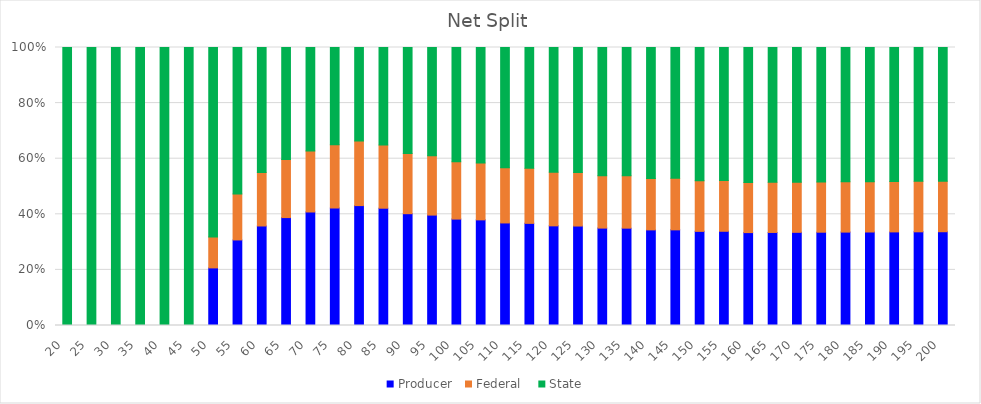
| Category | Producer  | Federal   | State   |
|---|---|---|---|
| 20.0 | 0 | 0 | 1 |
| 25.0 | 0 | 0 | 1 |
| 30.0 | 0 | 0 | 1 |
| 35.0 | 0 | 0 | 1 |
| 40.0 | 0 | 0 | 1 |
| 45.0 | 0 | 0 | 1 |
| 50.0 | 0.207 | 0.112 | 0.681 |
| 55.0 | 0.308 | 0.166 | 0.527 |
| 60.0 | 0.358 | 0.193 | 0.449 |
| 65.0 | 0.388 | 0.209 | 0.403 |
| 70.0 | 0.408 | 0.22 | 0.372 |
| 75.0 | 0.423 | 0.228 | 0.35 |
| 80.0 | 0.431 | 0.232 | 0.336 |
| 85.0 | 0.422 | 0.227 | 0.351 |
| 90.0 | 0.402 | 0.217 | 0.381 |
| 95.0 | 0.397 | 0.214 | 0.389 |
| 100.0 | 0.383 | 0.206 | 0.411 |
| 105.0 | 0.38 | 0.205 | 0.415 |
| 110.0 | 0.369 | 0.199 | 0.432 |
| 115.0 | 0.367 | 0.198 | 0.435 |
| 120.0 | 0.358 | 0.193 | 0.448 |
| 125.0 | 0.358 | 0.193 | 0.45 |
| 130.0 | 0.35 | 0.189 | 0.461 |
| 135.0 | 0.35 | 0.189 | 0.461 |
| 140.0 | 0.344 | 0.185 | 0.471 |
| 145.0 | 0.344 | 0.185 | 0.471 |
| 150.0 | 0.339 | 0.182 | 0.479 |
| 155.0 | 0.339 | 0.183 | 0.479 |
| 160.0 | 0.334 | 0.18 | 0.486 |
| 165.0 | 0.335 | 0.18 | 0.485 |
| 170.0 | 0.335 | 0.18 | 0.484 |
| 175.0 | 0.336 | 0.181 | 0.484 |
| 180.0 | 0.336 | 0.181 | 0.483 |
| 185.0 | 0.336 | 0.181 | 0.483 |
| 190.0 | 0.337 | 0.181 | 0.482 |
| 195.0 | 0.337 | 0.181 | 0.482 |
| 200.0 | 0.337 | 0.182 | 0.481 |